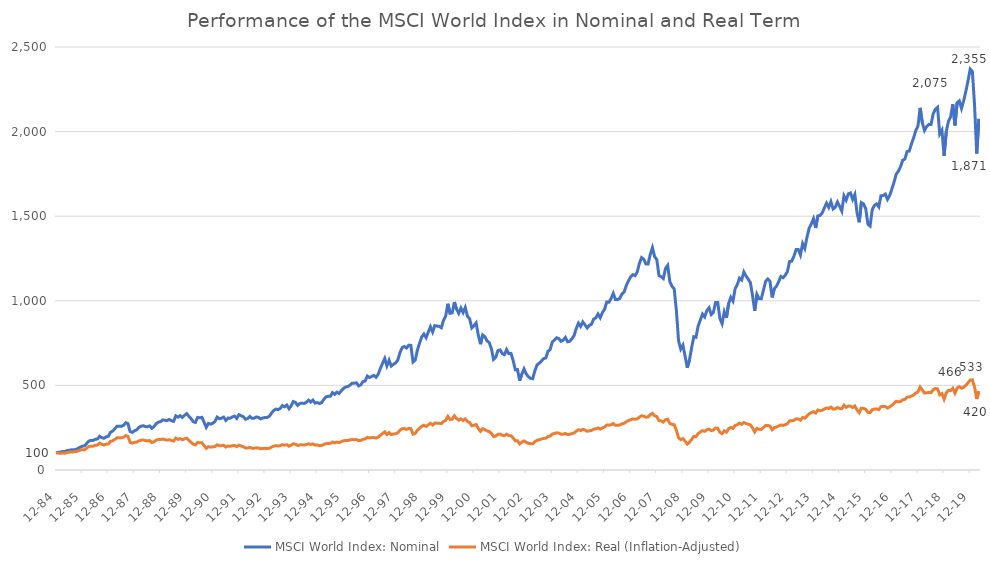
| Category | MSCI World Index: Nominal | MSCI World Index: Real (Inflation-Adjusted) |
|---|---|---|
| 1984-12-31 | 100 | 100 |
| 1985-01-31 | 105.495 | 100.844 |
| 1985-02-28 | 105.675 | 98.429 |
| 1985-03-29 | 109.316 | 100.277 |
| 1985-04-30 | 108.988 | 98.885 |
| 1985-05-31 | 114.561 | 103.615 |
| 1985-06-28 | 116.577 | 105.283 |
| 1985-07-31 | 118.953 | 107.073 |
| 1985-08-30 | 119.898 | 107.094 |
| 1985-09-30 | 120.763 | 107.743 |
| 1985-10-31 | 127.232 | 112.402 |
| 1985-11-29 | 134.311 | 116.843 |
| 1985-12-31 | 140.565 | 120.312 |
| 1986-01-31 | 142.61 | 118.941 |
| 1986-02-28 | 155.423 | 127.964 |
| 1986-03-31 | 170.574 | 138.837 |
| 1986-04-30 | 175.222 | 140.81 |
| 1986-05-30 | 174.673 | 141.004 |
| 1986-06-30 | 181.636 | 146.16 |
| 1986-07-31 | 183.049 | 147.307 |
| 1986-08-29 | 198.996 | 158.659 |
| 1986-09-30 | 191.039 | 151.688 |
| 1986-10-31 | 187.708 | 148.101 |
| 1986-11-28 | 195.599 | 153.03 |
| 1986-12-31 | 199.447 | 153.489 |
| 1987-01-30 | 222.823 | 168.935 |
| 1987-02-27 | 230.115 | 172.47 |
| 1987-03-31 | 244.309 | 180.673 |
| 1987-04-30 | 258.579 | 190.268 |
| 1987-05-29 | 258.88 | 190.286 |
| 1987-06-30 | 258.672 | 190.642 |
| 1987-07-31 | 263.78 | 193.808 |
| 1987-08-31 | 279.312 | 203.047 |
| 1987-09-30 | 274.387 | 198.916 |
| 1987-10-30 | 227.735 | 163.271 |
| 1987-11-30 | 222.13 | 158.668 |
| 1987-12-31 | 231.685 | 163.271 |
| 1988-01-29 | 237.271 | 164.845 |
| 1988-02-29 | 250.973 | 171.985 |
| 1988-03-31 | 258.483 | 175.949 |
| 1988-04-29 | 261.674 | 177.459 |
| 1988-05-31 | 256.375 | 173.282 |
| 1988-06-30 | 255.951 | 172.093 |
| 1988-07-29 | 260.695 | 173.856 |
| 1988-08-31 | 246.303 | 162.133 |
| 1988-09-30 | 256.683 | 167.254 |
| 1988-10-31 | 273.696 | 176.771 |
| 1988-11-30 | 283.151 | 180.34 |
| 1988-12-30 | 285.637 | 179.795 |
| 1989-01-31 | 295.899 | 182.998 |
| 1989-02-28 | 293.964 | 179.397 |
| 1989-03-31 | 292.002 | 176.691 |
| 1989-04-28 | 298.664 | 178.895 |
| 1989-05-31 | 291.264 | 174.155 |
| 1989-06-30 | 287.9 | 170.996 |
| 1989-07-31 | 320.354 | 188.512 |
| 1989-08-31 | 312.523 | 180.922 |
| 1989-09-29 | 321.267 | 185.584 |
| 1989-10-31 | 310.472 | 178.461 |
| 1989-11-30 | 322.785 | 183.819 |
| 1989-12-29 | 333.077 | 187.707 |
| 1990-01-31 | 317.44 | 174.7 |
| 1990-02-28 | 303.742 | 163.516 |
| 1990-03-30 | 285.312 | 152.7 |
| 1990-04-30 | 281.11 | 148.737 |
| 1990-05-31 | 310.623 | 162.627 |
| 1990-06-29 | 308.318 | 160.948 |
| 1990-07-31 | 311.035 | 161.224 |
| 1990-08-31 | 281.827 | 144.369 |
| 1990-09-28 | 252.014 | 127.741 |
| 1990-10-31 | 275.443 | 138.115 |
| 1990-11-30 | 270.822 | 134.92 |
| 1990-12-31 | 276.395 | 136.641 |
| 1991-01-31 | 286.405 | 138.577 |
| 1991-02-28 | 312.82 | 148.823 |
| 1991-03-29 | 303.505 | 143.593 |
| 1991-04-30 | 305.783 | 143.675 |
| 1991-05-31 | 312.618 | 145.824 |
| 1991-06-28 | 293.225 | 135.877 |
| 1991-07-31 | 306.978 | 141.607 |
| 1991-08-30 | 305.908 | 140.191 |
| 1991-09-30 | 313.835 | 143.548 |
| 1991-10-31 | 318.829 | 145.022 |
| 1991-11-29 | 304.839 | 137.984 |
| 1991-12-31 | 326.932 | 147.098 |
| 1992-01-31 | 320.783 | 141.863 |
| 1992-02-28 | 315.152 | 137.768 |
| 1992-03-31 | 300.21 | 129.992 |
| 1992-04-30 | 304.296 | 129.791 |
| 1992-05-29 | 316.303 | 133.75 |
| 1992-06-30 | 305.609 | 128.722 |
| 1992-07-31 | 306.29 | 128.459 |
| 1992-08-31 | 313.637 | 130.955 |
| 1992-09-30 | 310.661 | 129.692 |
| 1992-10-30 | 302.147 | 125.704 |
| 1992-11-30 | 307.457 | 127.49 |
| 1992-12-31 | 309.846 | 127.983 |
| 1993-01-29 | 310.789 | 126.555 |
| 1993-02-26 | 318.058 | 128.556 |
| 1993-03-31 | 336.405 | 135.427 |
| 1993-04-30 | 351.903 | 140.87 |
| 1993-05-31 | 359.92 | 143.408 |
| 1993-06-30 | 356.808 | 141.844 |
| 1993-07-30 | 364.066 | 143.884 |
| 1993-08-31 | 380.664 | 149.863 |
| 1993-09-30 | 373.54 | 146.641 |
| 1993-10-29 | 383.744 | 149.845 |
| 1993-11-30 | 361.946 | 140.46 |
| 1993-12-31 | 379.568 | 146.922 |
| 1994-01-31 | 404.515 | 154.689 |
| 1994-02-28 | 399.19 | 151.817 |
| 1994-03-31 | 381.891 | 144.908 |
| 1994-04-29 | 393.607 | 148.514 |
| 1994-05-31 | 394.53 | 148.529 |
| 1994-06-30 | 393.345 | 147.875 |
| 1994-07-29 | 400.732 | 150.398 |
| 1994-08-31 | 412.709 | 154.607 |
| 1994-09-30 | 401.774 | 150.373 |
| 1994-10-31 | 413.111 | 154.021 |
| 1994-11-30 | 395.102 | 147.021 |
| 1994-12-30 | 398.835 | 147.96 |
| 1995-01-31 | 392.753 | 143.649 |
| 1995-02-28 | 398.383 | 144.883 |
| 1995-03-31 | 417.489 | 151.127 |
| 1995-04-28 | 431.942 | 155.688 |
| 1995-05-31 | 435.539 | 157.106 |
| 1995-06-30 | 435.307 | 157.357 |
| 1995-07-31 | 456.989 | 165.142 |
| 1995-08-31 | 446.71 | 160.76 |
| 1995-09-29 | 459.624 | 165.184 |
| 1995-10-31 | 452.289 | 161.992 |
| 1995-11-30 | 467.894 | 167.463 |
| 1995-12-29 | 481.475 | 172.501 |
| 1996-01-31 | 490.086 | 174.77 |
| 1996-02-29 | 492.97 | 174.771 |
| 1996-03-29 | 501.071 | 177.017 |
| 1996-04-30 | 512.75 | 179.7 |
| 1996-05-31 | 513.091 | 179.144 |
| 1996-06-28 | 515.583 | 180.098 |
| 1996-07-31 | 497.258 | 173.44 |
| 1996-08-30 | 502.87 | 174.885 |
| 1996-09-30 | 522.455 | 181.715 |
| 1996-10-31 | 525.999 | 183.049 |
| 1996-11-29 | 555.371 | 192.914 |
| 1996-12-31 | 546.373 | 189.698 |
| 1997-01-31 | 552.855 | 190.791 |
| 1997-02-28 | 559.11 | 192.623 |
| 1997-03-31 | 547.946 | 188.529 |
| 1997-04-30 | 565.753 | 194.343 |
| 1997-05-30 | 600.57 | 205.058 |
| 1997-06-30 | 630.42 | 215.818 |
| 1997-07-31 | 659.353 | 225.66 |
| 1997-08-29 | 615.141 | 209.524 |
| 1997-09-30 | 648.456 | 221.01 |
| 1997-10-31 | 614.223 | 209.456 |
| 1997-11-28 | 624.987 | 212.284 |
| 1997-12-31 | 632.5 | 214.33 |
| 1998-01-30 | 650.021 | 219.971 |
| 1998-02-27 | 693.886 | 234.92 |
| 1998-03-31 | 723.08 | 244.146 |
| 1998-04-30 | 730.037 | 244.747 |
| 1998-05-29 | 720.779 | 240.147 |
| 1998-06-30 | 737.776 | 245.494 |
| 1998-07-31 | 736.483 | 244.555 |
| 1998-08-31 | 638.16 | 211.87 |
| 1998-09-30 | 649.337 | 215.839 |
| 1998-10-30 | 707.926 | 234.476 |
| 1998-11-30 | 749.914 | 247.167 |
| 1998-12-31 | 786.438 | 258.293 |
| 1999-01-29 | 803.544 | 264.783 |
| 1999-02-26 | 782.054 | 257.618 |
| 1999-03-31 | 814.502 | 267.165 |
| 1999-04-30 | 846.496 | 275.904 |
| 1999-05-31 | 815.45 | 265.47 |
| 1999-06-30 | 853.37 | 277.389 |
| 1999-07-30 | 850.695 | 276.581 |
| 1999-08-31 | 849.067 | 276.483 |
| 1999-09-30 | 840.718 | 273.825 |
| 1999-10-29 | 884.304 | 287.232 |
| 1999-11-30 | 909.066 | 293.564 |
| 1999-12-31 | 982.535 | 316.502 |
| 2000-01-31 | 926.156 | 298.926 |
| 2000-02-29 | 928.542 | 300.381 |
| 2000-03-31 | 992.607 | 320.622 |
| 2000-04-28 | 950.523 | 303.49 |
| 2000-05-31 | 926.346 | 294.113 |
| 2000-06-30 | 957.423 | 302.467 |
| 2000-07-31 | 930.356 | 292.953 |
| 2000-08-31 | 960.503 | 302.328 |
| 2000-09-29 | 909.318 | 286.475 |
| 2000-10-31 | 893.971 | 280.497 |
| 2000-11-30 | 839.583 | 261.367 |
| 2000-12-29 | 853.053 | 264.576 |
| 2001-01-31 | 869.48 | 268.683 |
| 2001-02-28 | 795.902 | 245.644 |
| 2001-03-30 | 743.491 | 228.466 |
| 2001-04-30 | 798.297 | 243.93 |
| 2001-05-31 | 787.895 | 238.755 |
| 2001-06-29 | 763.098 | 230.639 |
| 2001-07-31 | 752.898 | 227.3 |
| 2001-08-31 | 716.649 | 216.774 |
| 2001-09-28 | 653.405 | 197.713 |
| 2001-10-31 | 665.882 | 200.711 |
| 2001-11-30 | 705.174 | 211.151 |
| 2001-12-31 | 709.536 | 212.041 |
| 2002-01-31 | 687.968 | 205.267 |
| 2002-02-28 | 681.917 | 203.813 |
| 2002-03-29 | 711.956 | 211.877 |
| 2002-04-30 | 687.756 | 203.028 |
| 2002-05-31 | 688.903 | 202.033 |
| 2002-06-28 | 646.986 | 189.129 |
| 2002-07-31 | 592.394 | 172.875 |
| 2002-08-30 | 593.406 | 173.042 |
| 2002-09-30 | 528.072 | 154.081 |
| 2002-10-31 | 566.982 | 164.374 |
| 2002-11-29 | 597.465 | 171.965 |
| 2002-12-31 | 568.437 | 163.384 |
| 2003-01-31 | 551.114 | 158.171 |
| 2003-02-28 | 541.469 | 155.428 |
| 2003-03-31 | 539.682 | 154.807 |
| 2003-04-30 | 587.507 | 167.239 |
| 2003-05-30 | 620.957 | 175.771 |
| 2003-06-30 | 631.625 | 178.8 |
| 2003-07-31 | 644.378 | 182.946 |
| 2003-08-29 | 658.22 | 186.785 |
| 2003-09-30 | 662.182 | 187.554 |
| 2003-10-31 | 701.411 | 197.592 |
| 2003-11-28 | 712.012 | 200.023 |
| 2003-12-31 | 756.627 | 212.434 |
| 2004-01-30 | 768.768 | 215.83 |
| 2004-02-27 | 781.641 | 219.777 |
| 2004-03-31 | 776.454 | 217.815 |
| 2004-04-30 | 760.551 | 211.554 |
| 2004-05-31 | 767.481 | 212.095 |
| 2004-06-30 | 783.236 | 215.963 |
| 2004-07-30 | 757.664 | 209.307 |
| 2004-08-31 | 760.994 | 210.961 |
| 2004-09-30 | 775.39 | 215.123 |
| 2004-10-29 | 794.364 | 218.975 |
| 2004-11-30 | 836.093 | 229.225 |
| 2004-12-31 | 868.009 | 237.791 |
| 2005-01-31 | 848.467 | 233.497 |
| 2005-02-28 | 875.344 | 240.996 |
| 2005-03-31 | 858.353 | 235.513 |
| 2005-04-29 | 839.65 | 228.824 |
| 2005-05-31 | 854.568 | 231.924 |
| 2005-06-30 | 861.963 | 233.873 |
| 2005-07-29 | 892.072 | 241.317 |
| 2005-08-31 | 898.794 | 242.868 |
| 2005-09-30 | 922.139 | 248.698 |
| 2005-10-31 | 899.767 | 241.535 |
| 2005-11-30 | 929.747 | 248.54 |
| 2005-12-30 | 950.345 | 253.796 |
| 2006-01-31 | 992.781 | 266.024 |
| 2006-02-28 | 991.303 | 265.083 |
| 2006-03-31 | 1013.101 | 267.536 |
| 2006-04-28 | 1043.859 | 274.241 |
| 2006-05-31 | 1008.202 | 263.74 |
| 2006-06-30 | 1007.907 | 263.787 |
| 2006-07-31 | 1014.197 | 266.05 |
| 2006-08-31 | 1040.523 | 273.377 |
| 2006-09-29 | 1052.929 | 275.487 |
| 2006-10-31 | 1091.575 | 285.396 |
| 2006-11-30 | 1118.305 | 291.99 |
| 2006-12-29 | 1141.042 | 297.268 |
| 2007-01-31 | 1154.512 | 301.602 |
| 2007-02-28 | 1148.504 | 300.083 |
| 2007-03-30 | 1169.528 | 301.807 |
| 2007-04-30 | 1221.106 | 312.264 |
| 2007-05-31 | 1255.321 | 320.546 |
| 2007-06-29 | 1245.639 | 318.237 |
| 2007-07-31 | 1218.052 | 312.091 |
| 2007-08-31 | 1217.128 | 313.336 |
| 2007-09-28 | 1275.009 | 326.774 |
| 2007-10-31 | 1314.116 | 334.955 |
| 2007-11-30 | 1260.4 | 320.152 |
| 2007-12-31 | 1244.139 | 315.665 |
| 2008-01-31 | 1149.063 | 291.91 |
| 2008-02-29 | 1142.412 | 290.192 |
| 2008-03-31 | 1131.462 | 283.217 |
| 2008-04-30 | 1190.929 | 297.172 |
| 2008-05-30 | 1209.089 | 300.388 |
| 2008-06-30 | 1112.656 | 275.052 |
| 2008-07-31 | 1085.469 | 269.894 |
| 2008-08-29 | 1070.221 | 267.452 |
| 2008-09-30 | 942.932 | 234.39 |
| 2008-10-31 | 764.151 | 190.243 |
| 2008-11-28 | 714.688 | 179.071 |
| 2008-12-31 | 737.618 | 185.701 |
| 2009-01-30 | 672.998 | 170.528 |
| 2009-02-27 | 604.111 | 153.154 |
| 2009-03-31 | 649.666 | 163.405 |
| 2009-04-30 | 722.545 | 181.283 |
| 2009-05-29 | 788.012 | 198.095 |
| 2009-06-30 | 784.457 | 197.053 |
| 2009-07-31 | 850.898 | 214.885 |
| 2009-08-31 | 886.002 | 224.4 |
| 2009-09-30 | 921.317 | 232.895 |
| 2009-10-30 | 904.925 | 228.623 |
| 2009-11-30 | 941.903 | 237.405 |
| 2009-12-31 | 958.817 | 241.501 |
| 2010-01-29 | 919.188 | 232.639 |
| 2010-02-26 | 932.146 | 235.839 |
| 2010-03-31 | 989.874 | 247.572 |
| 2010-04-30 | 990.013 | 246.603 |
| 2010-05-31 | 895.181 | 222.68 |
| 2010-06-30 | 864.489 | 214.636 |
| 2010-07-30 | 934.576 | 231.643 |
| 2010-08-31 | 899.683 | 223.44 |
| 2010-09-30 | 983.575 | 243.829 |
| 2010-10-29 | 1020.238 | 251.843 |
| 2010-11-30 | 998.212 | 245.974 |
| 2010-12-31 | 1071.606 | 263.287 |
| 2011-01-31 | 1095.815 | 267.695 |
| 2011-02-28 | 1134.183 | 277.082 |
| 2011-03-31 | 1122.998 | 270.005 |
| 2011-04-29 | 1170.705 | 280.295 |
| 2011-05-31 | 1146.419 | 274.621 |
| 2011-06-30 | 1128.283 | 270.905 |
| 2011-07-29 | 1107.824 | 266.193 |
| 2011-08-31 | 1029.77 | 248.527 |
| 2011-09-30 | 940.828 | 225.225 |
| 2011-10-31 | 1038.145 | 245.937 |
| 2011-11-30 | 1012.798 | 240.122 |
| 2011-12-30 | 1012.235 | 240.03 |
| 2012-01-31 | 1063.032 | 250.879 |
| 2012-02-29 | 1114.96 | 262.921 |
| 2012-03-30 | 1129.294 | 263.231 |
| 2012-04-30 | 1116.47 | 259.511 |
| 2012-05-31 | 1020.092 | 237.943 |
| 2012-06-29 | 1072.071 | 250.616 |
| 2012-07-31 | 1085.853 | 253.878 |
| 2012-08-31 | 1113.381 | 260.685 |
| 2012-09-28 | 1143.97 | 266.187 |
| 2012-10-31 | 1136.239 | 263.561 |
| 2012-11-30 | 1150.789 | 267.779 |
| 2012-12-31 | 1172.431 | 272.782 |
| 2013-01-31 | 1232.154 | 290.284 |
| 2013-02-28 | 1234.188 | 291.113 |
| 2013-03-29 | 1263.097 | 293.089 |
| 2013-04-30 | 1302.873 | 302.285 |
| 2013-05-31 | 1303.365 | 301.883 |
| 2013-06-28 | 1271.25 | 294.293 |
| 2013-07-31 | 1338.176 | 310.519 |
| 2013-08-30 | 1309.693 | 306.179 |
| 2013-09-30 | 1375.194 | 319.62 |
| 2013-10-31 | 1429.024 | 332.294 |
| 2013-11-29 | 1454.42 | 338.952 |
| 2013-12-31 | 1485.195 | 344.878 |
| 2014-01-31 | 1430.186 | 336.742 |
| 2014-02-28 | 1501.782 | 354.525 |
| 2014-03-31 | 1503.956 | 350.258 |
| 2014-04-30 | 1519.367 | 353.013 |
| 2014-05-30 | 1549.26 | 360.417 |
| 2014-06-30 | 1576.975 | 366.606 |
| 2014-07-31 | 1551.808 | 363.261 |
| 2014-08-29 | 1586.002 | 372.112 |
| 2014-09-30 | 1542.956 | 359.955 |
| 2014-10-31 | 1552.938 | 361.093 |
| 2014-11-28 | 1584.06 | 369.094 |
| 2014-12-31 | 1558.517 | 363.2 |
| 2015-01-30 | 1530.277 | 361.731 |
| 2015-02-27 | 1619.934 | 383.211 |
| 2015-03-31 | 1594.576 | 370.215 |
| 2015-04-30 | 1631.973 | 377.673 |
| 2015-05-29 | 1637.595 | 377.366 |
| 2015-06-30 | 1599.517 | 368.886 |
| 2015-07-31 | 1628.228 | 378.249 |
| 2015-08-31 | 1520.481 | 354.407 |
| 2015-09-30 | 1464.399 | 338.665 |
| 2015-10-30 | 1580.444 | 365.176 |
| 2015-11-30 | 1572.58 | 364.076 |
| 2015-12-31 | 1544.938 | 358.612 |
| 2016-01-29 | 1452.513 | 340.69 |
| 2016-02-29 | 1441.703 | 339.676 |
| 2016-03-31 | 1539.536 | 355.837 |
| 2016-04-29 | 1563.897 | 360.205 |
| 2016-05-31 | 1572.68 | 361.206 |
| 2016-06-30 | 1555.058 | 356.685 |
| 2016-07-29 | 1620.757 | 374.228 |
| 2016-08-31 | 1622.104 | 375.378 |
| 2016-09-30 | 1630.72 | 374.768 |
| 2016-10-31 | 1599.161 | 366.261 |
| 2016-11-30 | 1622.155 | 373.406 |
| 2016-12-30 | 1660.971 | 382.19 |
| 2017-01-31 | 1701.059 | 393.746 |
| 2017-02-28 | 1748.252 | 405.603 |
| 2017-03-31 | 1766.874 | 402.863 |
| 2017-04-28 | 1793.036 | 404.969 |
| 2017-05-31 | 1830.967 | 414.514 |
| 2017-06-30 | 1838.011 | 417.79 |
| 2017-07-31 | 1881.999 | 430.664 |
| 2017-08-31 | 1884.65 | 431.237 |
| 2017-09-29 | 1926.949 | 436.777 |
| 2017-10-31 | 1963.365 | 443.503 |
| 2017-11-30 | 2005.907 | 454.697 |
| 2017-12-29 | 2033.034 | 461.043 |
| 2018-01-31 | 2140.378 | 490.377 |
| 2018-02-28 | 2051.708 | 473.275 |
| 2018-03-30 | 2006.988 | 454.483 |
| 2018-04-30 | 2030.05 | 456.69 |
| 2018-05-31 | 2042.772 | 457.691 |
| 2018-06-29 | 2041.797 | 457.178 |
| 2018-07-31 | 2105.57 | 474.351 |
| 2018-08-31 | 2131.622 | 481.884 |
| 2018-09-28 | 2143.491 | 479.163 |
| 2018-10-31 | 1986.099 | 444.379 |
| 2018-11-30 | 2008.661 | 451.447 |
| 2018-12-31 | 1855.926 | 418.102 |
| 2019-01-31 | 2000.328 | 456.12 |
| 2019-02-28 | 2060.478 | 470.874 |
| 2019-03-29 | 2087.541 | 468.756 |
| 2019-04-30 | 2161.564 | 482.556 |
| 2019-05-31 | 2036.84 | 454.447 |
| 2019-06-28 | 2171.057 | 484.245 |
| 2019-07-31 | 2181.811 | 493.082 |
| 2019-08-30 | 2137.183 | 483.553 |
| 2019-09-30 | 2182.664 | 488.467 |
| 2019-10-31 | 2238.207 | 500.71 |
| 2019-11-29 | 2300.542 | 515.415 |
| 2019-12-31 | 2369.462 | 531.56 |
| 2020-01-31 | 2355.04 | 532.741 |
| 2020-02-28 | 2155.98 | 490.835 |
| 2020-03-31 | 1870.652 | 419.855 |
| 2020-04-30 | 2075.009 | 465.722 |